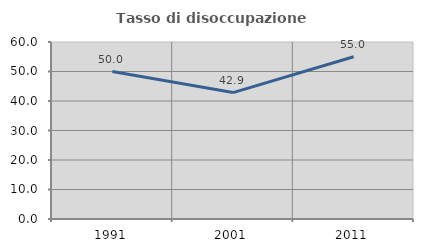
| Category | Tasso di disoccupazione giovanile  |
|---|---|
| 1991.0 | 50 |
| 2001.0 | 42.857 |
| 2011.0 | 55 |